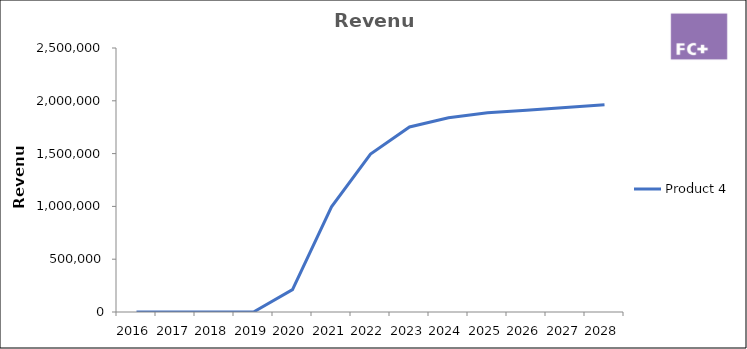
| Category | Product 4 |
|---|---|
| 2016.0 | 0 |
| 2017.0 | 0 |
| 2018.0 | 0 |
| 2019.0 | 0 |
| 2020.0 | 212030.965 |
| 2021.0 | 996514.01 |
| 2022.0 | 1495993.276 |
| 2023.0 | 1752543.706 |
| 2024.0 | 1839967.821 |
| 2025.0 | 1886309.329 |
| 2026.0 | 1911563.373 |
| 2027.0 | 1936817.417 |
| 2028.0 | 1962071.46 |